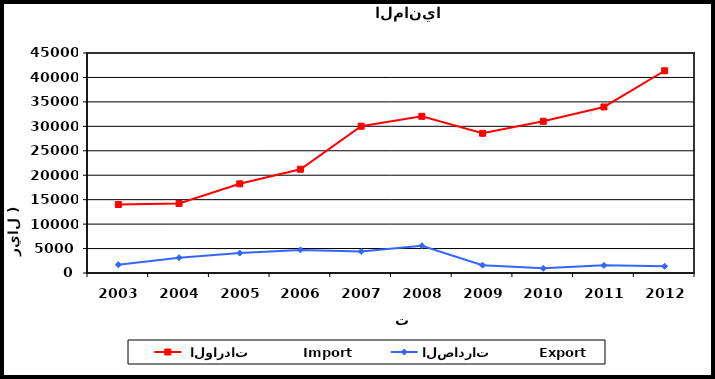
| Category |  الواردات           Import | الصادرات          Export |
|---|---|---|
| 2003.0 | 14009 | 1682 |
| 2004.0 | 14217 | 3135 |
| 2005.0 | 18238 | 4086 |
| 2006.0 | 21223 | 4729 |
| 2007.0 | 30022 | 4401 |
| 2008.0 | 32047 | 5588 |
| 2009.0 | 28572 | 1598 |
| 2010.0 | 31032 | 952 |
| 2011.0 | 33964 | 1560 |
| 2012.0 | 41367 | 1378 |